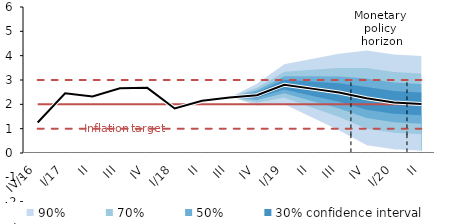
| Category | Inflation Target | Inflation Target - lower bound | Inflation Target - upper bound | linka | Centerline |
|---|---|---|---|---|---|
| IV/16 | 2 | 1 | 3 | 1.256 | 1.256 |
| I/17 | 2 | 1 | 3 | 2.455 | 2.455 |
| II | 2 | 1 | 3 | 2.327 | 2.327 |
| III | 2 | 1 | 3 | 2.66 | 2.66 |
| IV | 2 | 1 | 3 | 2.677 | 2.677 |
| I/18 | 2 | 1 | 3 | 1.831 | 1.831 |
| II | 2 | 1 | 3 | 2.145 | 2.145 |
| III | 2 | 1 | 3 | 2.279 | 2.279 |
| IV | 2 | 1 | 3 | 2.377 | 2.377 |
| I/19 | 2 | 1 | 3 | 2.807 | 2.807 |
| II | 2 | 1 | 3 | 2.645 | 2.645 |
| III | 2 | 1 | 3 | 2.487 | 2.487 |
| IV | 2 | 1 | 3 | 2.249 | 2.249 |
| I/20 | 2 | 1 | 3 | 2.078 | 2.078 |
| II | 2 | 1 | 3 | 2.018 | 2.018 |